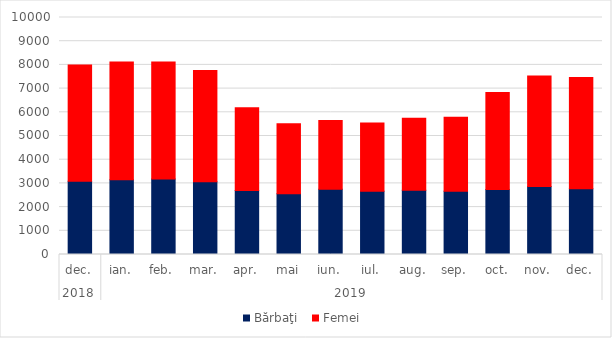
| Category | Bărbaţi | Femei |
|---|---|---|
| 0 | 3092 | 4909 |
| 1 | 3158 | 4963 |
| 2 | 3188 | 4934 |
| 3 | 3066 | 4693 |
| 4 | 2704 | 3491 |
| 5 | 2560 | 2954 |
| 6 | 2750 | 2906 |
| 7 | 2673 | 2879 |
| 8 | 2707 | 3046 |
| 9 | 2668 | 3123 |
| 10 | 2738 | 4098 |
| 11 | 2865 | 4671 |
| 12 | 2774 | 4697 |